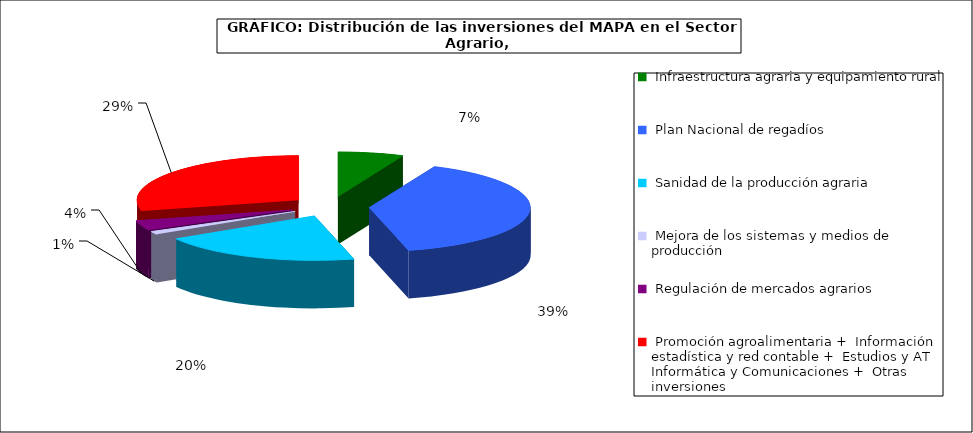
| Category | Series 0 |
|---|---|
|  Infraestructura agraria y equipamiento rural | 6402.29 |
|  Plan Nacional de regadíos | 38432.42 |
|  Sanidad de la producción agraria | 19744.18 |
|  Mejora de los sistemas y medios de producción | 1092.83 |
|  Regulación de mercados agrarios | 3507.47 |
|  Promoción agroalimentaria +  Información estadística y red contable +  Estudios y AT Informática y Comunicaciones +  Otras inversiones | 28125.97 |